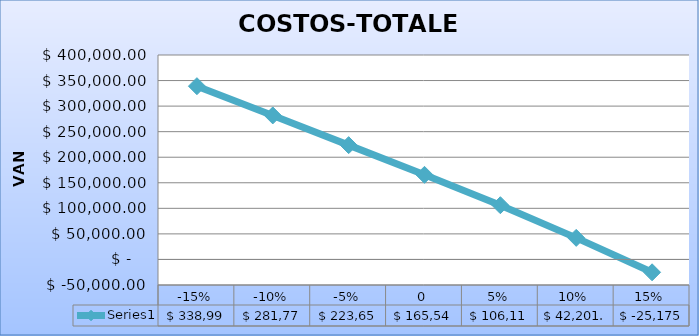
| Category | Series 0 |
|---|---|
| -0.15 | 338996.288 |
| -0.1 | 281773.359 |
| -0.05 | 223659.128 |
| 0.0 | 165544.897 |
| 0.05 | 106114.626 |
| 0.1 | 42201.65 |
| 0.15 | -25175.268 |